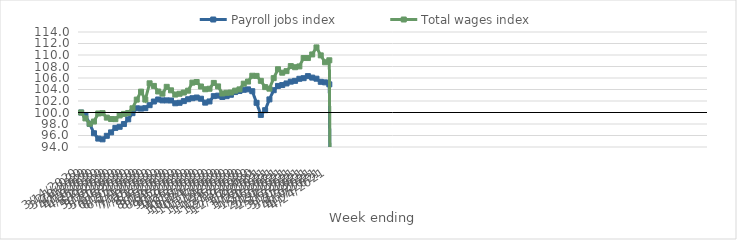
| Category | Payroll jobs index | Total wages index |
|---|---|---|
| 14/03/2020 | 100 | 100 |
| 21/03/2020 | 99.571 | 98.974 |
| 28/03/2020 | 98.032 | 98.038 |
| 04/04/2020 | 96.393 | 98.428 |
| 11/04/2020 | 95.463 | 99.831 |
| 18/04/2020 | 95.333 | 99.89 |
| 25/04/2020 | 95.946 | 99.11 |
| 02/05/2020 | 96.545 | 98.86 |
| 09/05/2020 | 97.324 | 98.842 |
| 16/05/2020 | 97.516 | 99.488 |
| 23/05/2020 | 97.994 | 99.755 |
| 30/05/2020 | 98.812 | 99.917 |
| 06/06/2020 | 99.886 | 100.731 |
| 13/06/2020 | 100.73 | 102.241 |
| 20/06/2020 | 100.678 | 103.626 |
| 27/06/2020 | 100.753 | 102.244 |
| 04/07/2020 | 101.274 | 105.078 |
| 11/07/2020 | 101.912 | 104.623 |
| 18/07/2020 | 102.266 | 103.658 |
| 25/07/2020 | 102.105 | 103.277 |
| 01/08/2020 | 102.109 | 104.464 |
| 08/08/2020 | 102.091 | 103.856 |
| 15/08/2020 | 101.604 | 103.119 |
| 22/08/2020 | 101.69 | 103.259 |
| 29/08/2020 | 101.983 | 103.47 |
| 05/09/2020 | 102.306 | 103.795 |
| 12/09/2020 | 102.484 | 105.195 |
| 19/09/2020 | 102.604 | 105.306 |
| 26/09/2020 | 102.399 | 104.524 |
| 03/10/2020 | 101.716 | 104.041 |
| 10/10/2020 | 101.922 | 104.133 |
| 17/10/2020 | 102.845 | 105.145 |
| 24/10/2020 | 102.934 | 104.538 |
| 31/10/2020 | 102.697 | 103.305 |
| 07/11/2020 | 102.84 | 103.427 |
| 14/11/2020 | 103.083 | 103.479 |
| 21/11/2020 | 103.554 | 103.803 |
| 28/11/2020 | 103.736 | 104.021 |
| 05/12/2020 | 103.947 | 105.014 |
| 12/12/2020 | 104.026 | 105.379 |
| 19/12/2020 | 103.704 | 106.392 |
| 26/12/2020 | 101.682 | 106.366 |
| 02/01/2021 | 99.579 | 105.506 |
| 09/01/2021 | 100.401 | 104.416 |
| 16/01/2021 | 102.28 | 104.144 |
| 23/01/2021 | 103.877 | 105.973 |
| 30/01/2021 | 104.62 | 107.522 |
| 06/02/2021 | 104.774 | 106.922 |
| 13/02/2021 | 105.052 | 107.194 |
| 20/02/2021 | 105.365 | 108.074 |
| 27/02/2021 | 105.505 | 107.874 |
| 06/03/2021 | 105.864 | 108.015 |
| 13/03/2021 | 105.971 | 109.48 |
| 20/03/2021 | 106.327 | 109.473 |
| 27/03/2021 | 106.069 | 110.095 |
| 03/04/2021 | 105.878 | 111.316 |
| 10/04/2021 | 105.335 | 109.935 |
| 17/04/2021 | 105.241 | 108.736 |
| 24/04/2021 | 104.895 | 109.082 |